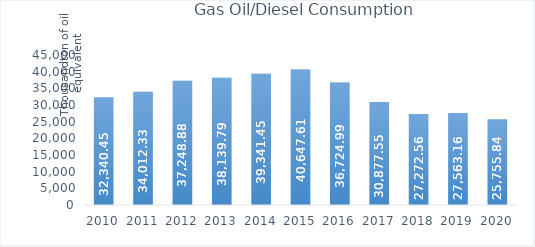
| Category | Gas Oil/Diesel Consumption |
|---|---|
| 2010.0 | 32340.45 |
| 2011.0 | 34012.33 |
| 2012.0 | 37248.88 |
| 2013.0 | 38139.79 |
| 2014.0 | 39341.45 |
| 2015.0 | 40647.61 |
| 2016.0 | 36724.99 |
| 2017.0 | 30877.55 |
| 2018.0 | 27272.56 |
| 2019.0 | 27563.16 |
| 2020.0 | 25755.84 |